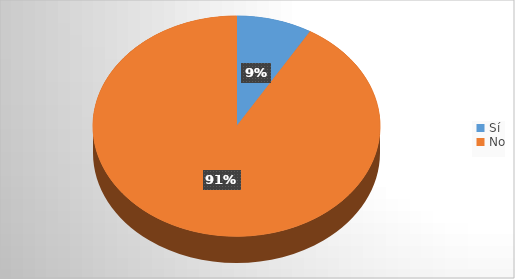
| Category | Series 0 |
|---|---|
| Sí | 7 |
| No | 75 |